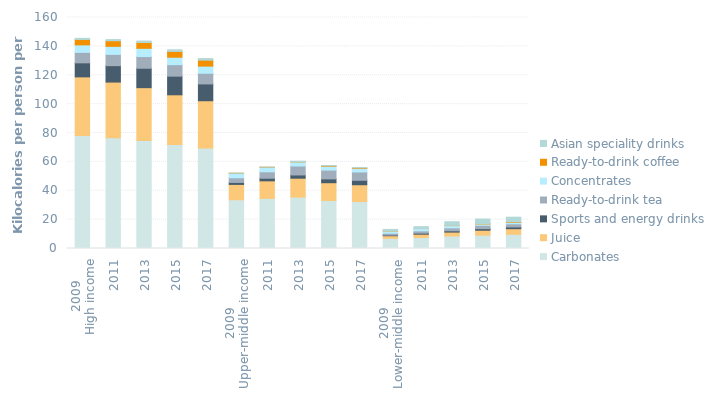
| Category | Carbonates | Juice | Sports and energy drinks | Ready-to-drink tea | Concentrates | Ready-to-drink coffee | Asian speciality drinks |
|---|---|---|---|---|---|---|---|
| 0 | 78.256 | 40.624 | 9.721 | 7.254 | 5.187 | 3.747 | 0.767 |
| 1 | 76.722 | 38.552 | 11.376 | 7.802 | 5.559 | 3.841 | 0.845 |
| 2 | 74.807 | 36.595 | 13.432 | 8.115 | 5.711 | 4.032 | 0.98 |
| 3 | 72.035 | 34.424 | 12.923 | 7.932 | 5.162 | 4.041 | 1.09 |
| 4 | 69.575 | 32.764 | 11.646 | 7.402 | 4.947 | 4.114 | 1.116 |
| 5 | 33.78 | 10.607 | 1.373 | 3.234 | 2.978 | 0.138 | 0.076 |
| 6 | 34.728 | 12.128 | 1.823 | 4.45 | 2.978 | 0.165 | 0.151 |
| 7 | 35.606 | 13.074 | 2.259 | 6.213 | 2.857 | 0.261 | 0.213 |
| 8 | 33.268 | 12.293 | 2.657 | 6.08 | 2.539 | 0.31 | 0.248 |
| 9 | 32.529 | 11.628 | 3.083 | 5.786 | 2.35 | 0.394 | 0.276 |
| 10 | 7.036 | 1.806 | 0.481 | 1.274 | 1.538 | 0.054 | 1.031 |
| 11 | 7.651 | 2.258 | 0.731 | 1.562 | 1.593 | 0.072 | 1.285 |
| 12 | 8.686 | 2.678 | 0.895 | 2.023 | 1.572 | 0.147 | 2.532 |
| 13 | 9.268 | 3.381 | 1.102 | 2.312 | 0.957 | 0.249 | 3.12 |
| 14 | 9.849 | 3.872 | 1.208 | 2.165 | 0.957 | 0.345 | 3.283 |